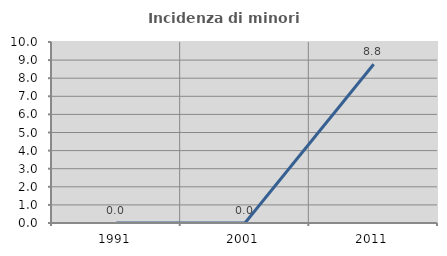
| Category | Incidenza di minori stranieri |
|---|---|
| 1991.0 | 0 |
| 2001.0 | 0 |
| 2011.0 | 8.772 |